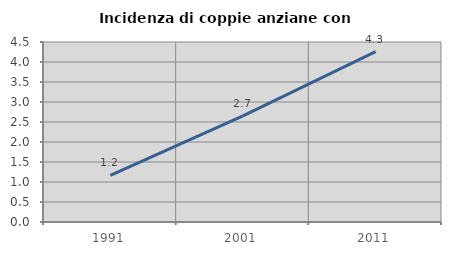
| Category | Incidenza di coppie anziane con figli |
|---|---|
| 1991.0 | 1.164 |
| 2001.0 | 2.653 |
| 2011.0 | 4.261 |